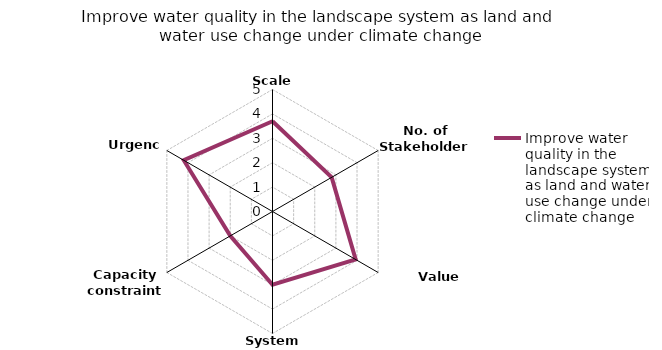
| Category | Improve water quality in the landscape system as land and water use change under climate change |
|---|---|
| Scale | 3.7 |
| No. of Stakeholders | 2.8 |
| Value divergence | 3.936 |
| System uncertainty | 3 |
| Capacity constraints | 2 |
| Urgency | 4.2 |